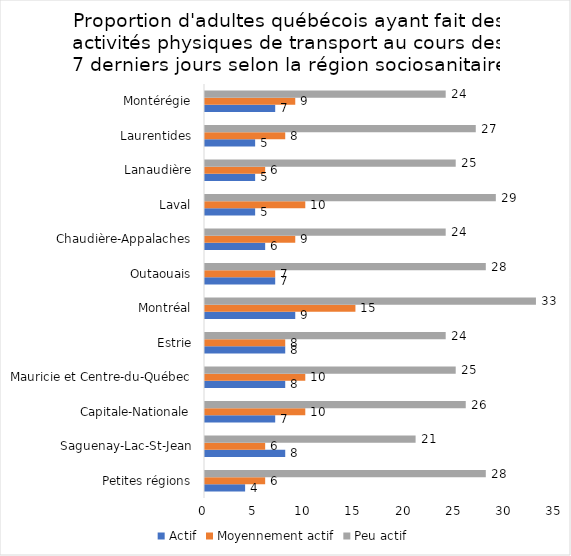
| Category | Actif | Moyennement actif | Peu actif |
|---|---|---|---|
| Petites régions | 4 | 6 | 28 |
| Saguenay-Lac-St-Jean | 8 | 6 | 21 |
| Capitale-Nationale | 7 | 10 | 26 |
| Mauricie et Centre-du-Québec | 8 | 10 | 25 |
| Estrie | 8 | 8 | 24 |
| Montréal | 9 | 15 | 33 |
| Outaouais | 7 | 7 | 28 |
| Chaudière-Appalaches | 6 | 9 | 24 |
| Laval | 5 | 10 | 29 |
| Lanaudière | 5 | 6 | 25 |
| Laurentides | 5 | 8 | 27 |
| Montérégie | 7 | 9 | 24 |